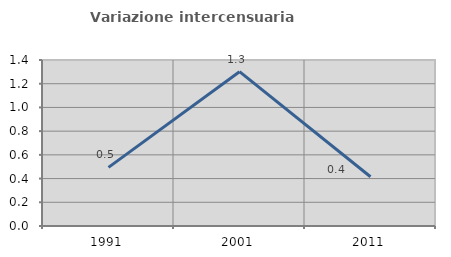
| Category | Variazione intercensuaria annua |
|---|---|
| 1991.0 | 0.495 |
| 2001.0 | 1.301 |
| 2011.0 | 0.415 |